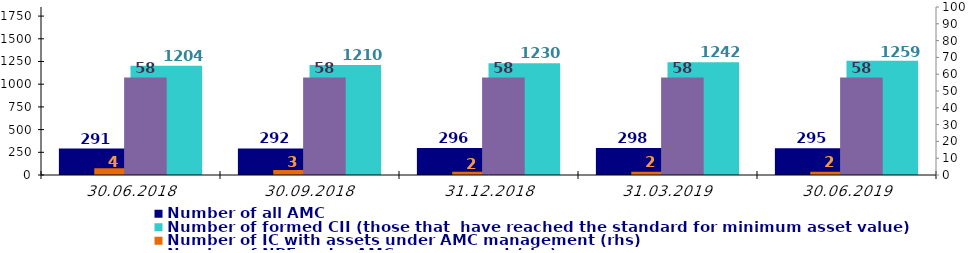
| Category | Number of registered CII per one AMC | Number of all AMC | Number of AMC with CII under management | Number of formed CII (those that  have reached the standard for minimum asset value) |
|---|---|---|---|---|
| 30.06.2018 |  | 291 |  | 1204 |
| 30.09.2018 |  | 292 |  | 1210 |
| 31.12.2018 |  | 296 |  | 1230 |
| 31.03.2019 |  | 298 |  | 1242 |
| 30.06.2019 |  | 295 |  | 1259 |